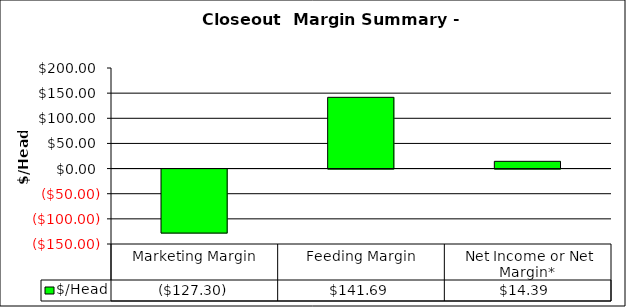
| Category | $/Head  |
|---|---|
| Marketing Margin | -127.297 |
| Feeding Margin | 141.691 |
| Net Income or Net Margin*  | 14.394 |